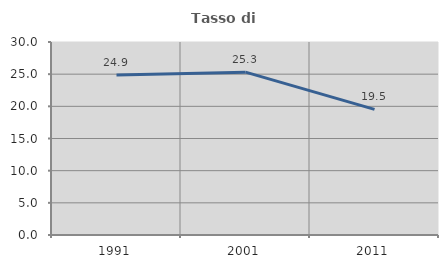
| Category | Tasso di occupazione   |
|---|---|
| 1991.0 | 24.883 |
| 2001.0 | 25.316 |
| 2011.0 | 19.522 |